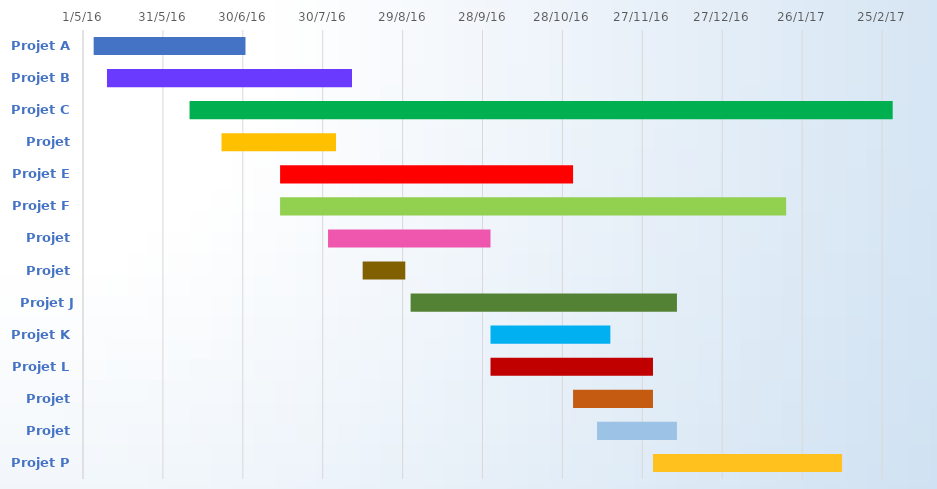
| Category | DÉBUT | Duration |
|---|---|---|
| Projet A | 2016-05-05 | 57 |
| Projet B | 2016-05-10 | 92 |
| Projet C | 2016-06-10 | 264 |
| Projet D | 2016-06-22 | 43 |
| Projet E | 2016-07-14 | 110 |
| Projet F | 2016-07-14 | 190 |
| Projet G | 2016-08-01 | 61 |
| Projet H | 2016-08-14 | 16 |
| Projet J | 2016-09-01 | 100 |
| Projet K | 2016-10-01 | 45 |
| Projet L | 2016-10-01 | 61 |
| Projet M | 2016-11-01 | 30 |
| Projet N | 2016-11-10 | 30 |
| Projet P | 2016-12-01 | 71 |